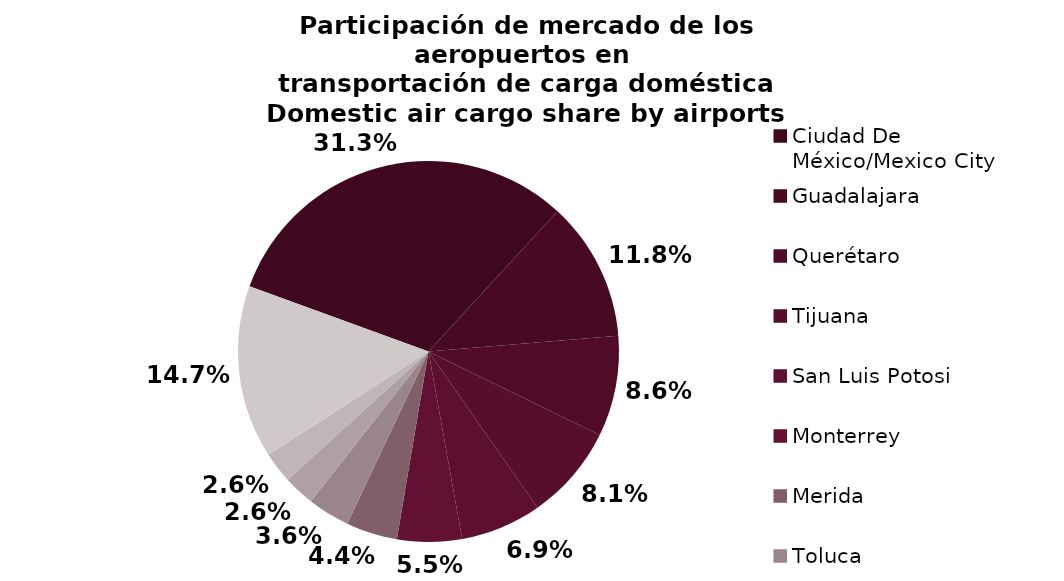
| Category | Series 0 |
|---|---|
| Ciudad De México/Mexico City | 7782.3 |
| Guadalajara | 2942.189 |
| Querétaro | 2128.441 |
| Tijuana | 2007.502 |
| San Luis Potosi | 1708.896 |
| Monterrey | 1364.492 |
| Merida | 1084.072 |
| Toluca | 890.183 |
| Hermosillo | 659.62 |
| Cancun | 655.238 |
| Otros/Others | 3649.575 |